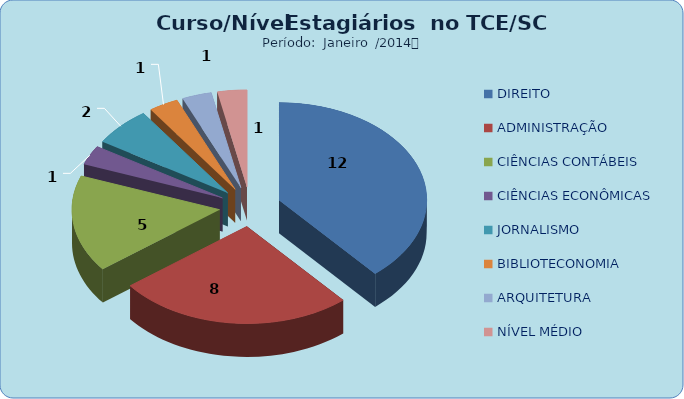
| Category | Series 0 |
|---|---|
| DIREITO | 12 |
| ADMINISTRAÇÃO | 8 |
| CIÊNCIAS CONTÁBEIS | 5 |
| CIÊNCIAS ECONÔMICAS | 1 |
| JORNALISMO | 2 |
| BIBLIOTECONOMIA | 1 |
| ARQUITETURA | 1 |
| NÍVEL MÉDIO | 1 |